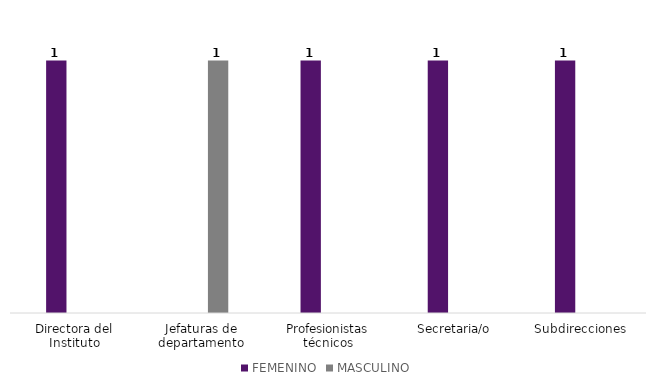
| Category | FEMENINO | MASCULINO |
|---|---|---|
| Directora del Instituto | 1 | 0 |
| Jefaturas de departamento | 0 | 1 |
| Profesionistas técnicos | 1 | 0 |
| Secretaria/o | 1 | 0 |
| Subdirecciones | 1 | 0 |